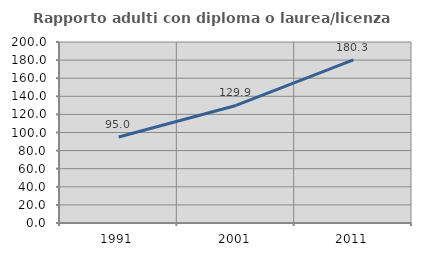
| Category | Rapporto adulti con diploma o laurea/licenza media  |
|---|---|
| 1991.0 | 95 |
| 2001.0 | 129.915 |
| 2011.0 | 180.342 |